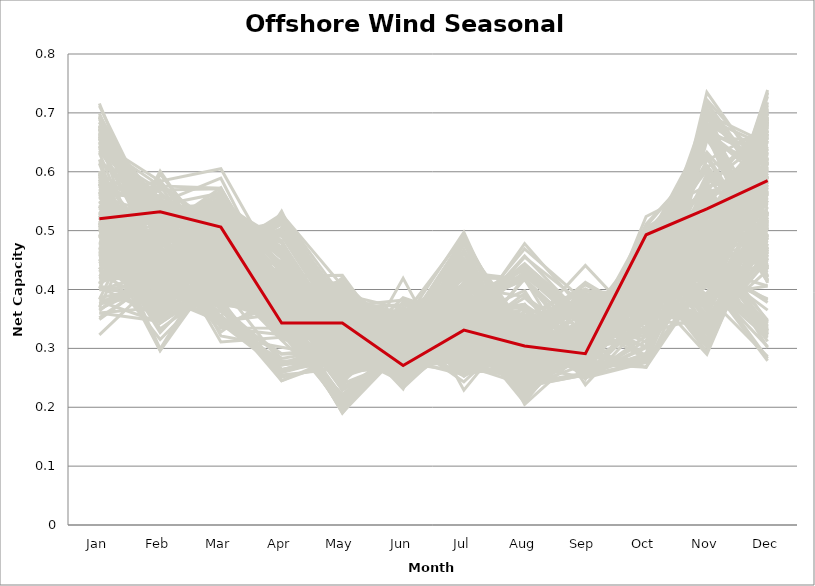
| Category | sample_001 | sample_002 | sample_003 | sample_004 | sample_005 | sample_006 | sample_007 | sample_008 | sample_009 | sample_010 | sample_011 | sample_012 | sample_013 | sample_014 | sample_015 | sample_016 | sample_017 | sample_018 | sample_019 | sample_020 | sample_021 | sample_022 | sample_023 | sample_024 | sample_025 | sample_026 | sample_027 | sample_028 | sample_029 | sample_030 | sample_031 | sample_032 | sample_033 | sample_034 | sample_035 | sample_036 | sample_037 | sample_038 | sample_039 | sample_040 | sample_041 | sample_042 | sample_043 | sample_044 | sample_045 | sample_046 | sample_047 | sample_048 | sample_049 | sample_050 | sample_051 | sample_052 | sample_053 | sample_054 | sample_055 | sample_056 | sample_057 | sample_058 | sample_059 | sample_060 | sample_061 | sample_062 | sample_063 | sample_064 | sample_065 | sample_066 | sample_067 | sample_068 | sample_069 | sample_070 | sample_071 | sample_072 | sample_073 | sample_074 | sample_075 | sample_076 | sample_077 | sample_078 | sample_079 | sample_080 | sample_081 | sample_082 | sample_083 | sample_084 | sample_085 | sample_086 | sample_087 | sample_088 | sample_089 | sample_090 | sample_091 | sample_092 | sample_093 | sample_094 | sample_095 | sample_096 | sample_097 | sample_098 | sample_099 | sample_100 | sample_101 | sample_102 | sample_103 | sample_104 | sample_105 | sample_106 | sample_107 | sample_108 | sample_109 | sample_110 | sample_111 | sample_112 | sample_113 | sample_114 | sample_115 | sample_116 | sample_117 | sample_118 | sample_119 | sample_120 | sample_121 | sample_122 | sample_123 | sample_124 | sample_125 | sample_126 | sample_127 | sample_128 | sample_129 | sample_130 | sample_131 | sample_132 | sample_133 | sample_134 | sample_135 | sample_136 | sample_137 | sample_138 | sample_139 | sample_140 | sample_141 | sample_142 | sample_143 | sample_144 | sample_145 | sample_146 | sample_147 | sample_148 | sample_149 | sample_150 | sample_151 | sample_152 | sample_153 | sample_154 | sample_155 | sample_156 | sample_157 | sample_158 | sample_159 | sample_160 | sample_161 | sample_162 | sample_163 | sample_164 | sample_165 | sample_166 | sample_167 | sample_168 | sample_169 | sample_170 | sample_171 | sample_172 | sample_173 | sample_174 | sample_175 | sample_176 | sample_177 | sample_178 | sample_179 | sample_180 | sample_181 | sample_182 | sample_183 | sample_184 | sample_185 | sample_186 | sample_188 | sample_189 | sample_190 | sample_191 | sample_192 | sample_193 | sample_194 | sample_195 | sample_196 | sample_197 | sample_198 | sample_199 | sample_200 | sample_201 | sample_202 | sample_203 | sample_204 | sample_205 | sample_206 | sample_207 | sample_208 | sample_209 | sample_210 | sample_211 | sample_212 | sample_213 | sample_214 | sample_215 | sample_216 | sample_217 | sample_218 | sample_219 | sample_220 | sample_221 | sample_222 | sample_223 | sample_224 | sample_225 | sample_226 | sample_227 | sample_228 | sample_229 | sample_230 | sample_231 | sample_232 | sample_233 | sample_234 | sample_235 | sample_236 | sample_237 | sample_238 | sample_239 | sample_240 | sample_241 | sample_242 | sample_243 | sample_244 | sample_245 | sample_246 | sample_247 | sample_248 | sample_249 | sample_250 | sample_187 |
|---|---|---|---|---|---|---|---|---|---|---|---|---|---|---|---|---|---|---|---|---|---|---|---|---|---|---|---|---|---|---|---|---|---|---|---|---|---|---|---|---|---|---|---|---|---|---|---|---|---|---|---|---|---|---|---|---|---|---|---|---|---|---|---|---|---|---|---|---|---|---|---|---|---|---|---|---|---|---|---|---|---|---|---|---|---|---|---|---|---|---|---|---|---|---|---|---|---|---|---|---|---|---|---|---|---|---|---|---|---|---|---|---|---|---|---|---|---|---|---|---|---|---|---|---|---|---|---|---|---|---|---|---|---|---|---|---|---|---|---|---|---|---|---|---|---|---|---|---|---|---|---|---|---|---|---|---|---|---|---|---|---|---|---|---|---|---|---|---|---|---|---|---|---|---|---|---|---|---|---|---|---|---|---|---|---|---|---|---|---|---|---|---|---|---|---|---|---|---|---|---|---|---|---|---|---|---|---|---|---|---|---|---|---|---|---|---|---|---|---|---|---|---|---|---|---|---|---|---|---|---|---|---|---|---|---|---|---|---|---|---|---|---|---|---|---|---|---|---|---|---|
| Jan | 0.597 | 0.549 | 0.648 | 0.349 | 0.482 | 0.409 | 0.692 | 0.477 | 0.529 | 0.541 | 0.643 | 0.671 | 0.406 | 0.635 | 0.467 | 0.656 | 0.36 | 0.323 | 0.508 | 0.66 | 0.533 | 0.689 | 0.679 | 0.549 | 0.521 | 0.587 | 0.442 | 0.529 | 0.651 | 0.644 | 0.496 | 0.565 | 0.454 | 0.509 | 0.565 | 0.669 | 0.674 | 0.642 | 0.579 | 0.37 | 0.465 | 0.53 | 0.376 | 0.586 | 0.654 | 0.673 | 0.47 | 0.448 | 0.512 | 0.542 | 0.684 | 0.677 | 0.462 | 0.483 | 0.575 | 0.383 | 0.43 | 0.634 | 0.496 | 0.588 | 0.53 | 0.614 | 0.658 | 0.646 | 0.411 | 0.526 | 0.562 | 0.595 | 0.599 | 0.49 | 0.472 | 0.399 | 0.449 | 0.504 | 0.529 | 0.639 | 0.514 | 0.53 | 0.529 | 0.517 | 0.47 | 0.549 | 0.364 | 0.458 | 0.486 | 0.508 | 0.517 | 0.352 | 0.46 | 0.557 | 0.508 | 0.671 | 0.636 | 0.662 | 0.507 | 0.65 | 0.491 | 0.464 | 0.491 | 0.583 | 0.566 | 0.48 | 0.656 | 0.584 | 0.452 | 0.465 | 0.716 | 0.571 | 0.481 | 0.41 | 0.451 | 0.499 | 0.459 | 0.455 | 0.366 | 0.516 | 0.597 | 0.505 | 0.527 | 0.494 | 0.667 | 0.595 | 0.601 | 0.544 | 0.617 | 0.666 | 0.55 | 0.569 | 0.448 | 0.426 | 0.474 | 0.522 | 0.504 | 0.505 | 0.443 | 0.538 | 0.696 | 0.559 | 0.525 | 0.452 | 0.588 | 0.595 | 0.443 | 0.434 | 0.4 | 0.434 | 0.419 | 0.467 | 0.65 | 0.693 | 0.673 | 0.712 | 0.672 | 0.58 | 0.468 | 0.479 | 0.456 | 0.558 | 0.423 | 0.422 | 0.621 | 0.402 | 0.383 | 0.541 | 0.489 | 0.693 | 0.508 | 0.678 | 0.663 | 0.458 | 0.509 | 0.583 | 0.523 | 0.502 | 0.512 | 0.471 | 0.423 | 0.643 | 0.531 | 0.556 | 0.645 | 0.486 | 0.566 | 0.512 | 0.497 | 0.521 | 0.375 | 0.433 | 0.507 | 0.38 | 0.36 | 0.664 | 0.597 | 0.564 | 0.656 | 0.578 | 0.676 | 0.684 | 0.477 | 0.488 | 0.526 | 0.5 | 0.418 | 0.632 | 0.58 | 0.451 | 0.418 | 0.492 | 0.528 | 0.386 | 0.578 | 0.367 | 0.53 | 0.428 | 0.592 | 0.563 | 0.494 | 0.665 | 0.402 | 0.616 | 0.515 | 0.66 | 0.438 | 0.542 | 0.533 | 0.492 | 0.411 | 0.49 | 0.376 | 0.47 | 0.517 | 0.523 | 0.674 | 0.514 | 0.404 | 0.455 | 0.471 | 0.511 | 0.506 | 0.461 | 0.501 | 0.591 | 0.573 | 0.453 | 0.699 | 0.515 | 0.443 | 0.54 | 0.639 | 0.52 |
| Feb | 0.465 | 0.471 | 0.522 | 0.425 | 0.424 | 0.52 | 0.477 | 0.549 | 0.521 | 0.426 | 0.538 | 0.526 | 0.381 | 0.556 | 0.551 | 0.485 | 0.346 | 0.421 | 0.526 | 0.501 | 0.473 | 0.514 | 0.435 | 0.473 | 0.442 | 0.399 | 0.435 | 0.487 | 0.44 | 0.531 | 0.523 | 0.584 | 0.495 | 0.333 | 0.445 | 0.52 | 0.514 | 0.447 | 0.399 | 0.585 | 0.423 | 0.447 | 0.428 | 0.411 | 0.55 | 0.501 | 0.551 | 0.533 | 0.359 | 0.468 | 0.528 | 0.519 | 0.534 | 0.438 | 0.437 | 0.596 | 0.561 | 0.569 | 0.494 | 0.542 | 0.388 | 0.347 | 0.514 | 0.576 | 0.454 | 0.299 | 0.407 | 0.39 | 0.346 | 0.413 | 0.352 | 0.432 | 0.42 | 0.362 | 0.492 | 0.54 | 0.363 | 0.436 | 0.522 | 0.503 | 0.507 | 0.509 | 0.444 | 0.548 | 0.519 | 0.516 | 0.405 | 0.422 | 0.344 | 0.527 | 0.374 | 0.536 | 0.494 | 0.499 | 0.423 | 0.584 | 0.5 | 0.374 | 0.424 | 0.449 | 0.405 | 0.409 | 0.51 | 0.541 | 0.425 | 0.415 | 0.464 | 0.431 | 0.482 | 0.579 | 0.398 | 0.527 | 0.535 | 0.542 | 0.426 | 0.528 | 0.538 | 0.393 | 0.549 | 0.327 | 0.522 | 0.41 | 0.409 | 0.455 | 0.533 | 0.489 | 0.415 | 0.463 | 0.315 | 0.374 | 0.548 | 0.398 | 0.453 | 0.476 | 0.419 | 0.447 | 0.515 | 0.458 | 0.522 | 0.357 | 0.436 | 0.407 | 0.416 | 0.575 | 0.393 | 0.553 | 0.433 | 0.354 | 0.523 | 0.507 | 0.452 | 0.501 | 0.52 | 0.371 | 0.503 | 0.425 | 0.409 | 0.472 | 0.428 | 0.515 | 0.348 | 0.601 | 0.379 | 0.414 | 0.526 | 0.445 | 0.541 | 0.428 | 0.486 | 0.527 | 0.352 | 0.452 | 0.509 | 0.56 | 0.543 | 0.356 | 0.457 | 0.518 | 0.481 | 0.454 | 0.51 | 0.531 | 0.447 | 0.297 | 0.576 | 0.371 | 0.407 | 0.411 | 0.534 | 0.344 | 0.37 | 0.543 | 0.457 | 0.42 | 0.496 | 0.416 | 0.479 | 0.505 | 0.535 | 0.519 | 0.381 | 0.527 | 0.509 | 0.382 | 0.414 | 0.354 | 0.42 | 0.486 | 0.489 | 0.407 | 0.421 | 0.414 | 0.481 | 0.448 | 0.389 | 0.554 | 0.402 | 0.497 | 0.406 | 0.565 | 0.391 | 0.343 | 0.407 | 0.388 | 0.412 | 0.296 | 0.474 | 0.428 | 0.416 | 0.401 | 0.414 | 0.394 | 0.547 | 0.388 | 0.353 | 0.435 | 0.421 | 0.535 | 0.549 | 0.549 | 0.343 | 0.403 | 0.548 | 0.399 | 0.476 | 0.494 | 0.453 | 0.466 | 0.539 | 0.532 |
| Mar | 0.419 | 0.419 | 0.504 | 0.451 | 0.345 | 0.499 | 0.466 | 0.503 | 0.335 | 0.499 | 0.545 | 0.478 | 0.427 | 0.449 | 0.516 | 0.518 | 0.5 | 0.424 | 0.487 | 0.573 | 0.389 | 0.454 | 0.547 | 0.559 | 0.549 | 0.381 | 0.515 | 0.407 | 0.533 | 0.536 | 0.404 | 0.46 | 0.346 | 0.408 | 0.406 | 0.483 | 0.494 | 0.554 | 0.353 | 0.438 | 0.539 | 0.373 | 0.452 | 0.485 | 0.523 | 0.458 | 0.507 | 0.484 | 0.523 | 0.399 | 0.464 | 0.444 | 0.499 | 0.342 | 0.42 | 0.468 | 0.488 | 0.571 | 0.352 | 0.482 | 0.394 | 0.406 | 0.465 | 0.572 | 0.328 | 0.466 | 0.524 | 0.451 | 0.404 | 0.354 | 0.419 | 0.339 | 0.534 | 0.555 | 0.435 | 0.53 | 0.526 | 0.374 | 0.335 | 0.407 | 0.556 | 0.321 | 0.429 | 0.474 | 0.51 | 0.372 | 0.509 | 0.437 | 0.411 | 0.474 | 0.544 | 0.456 | 0.478 | 0.466 | 0.384 | 0.605 | 0.519 | 0.551 | 0.348 | 0.391 | 0.514 | 0.4 | 0.564 | 0.486 | 0.517 | 0.523 | 0.449 | 0.416 | 0.383 | 0.502 | 0.39 | 0.504 | 0.471 | 0.489 | 0.415 | 0.373 | 0.483 | 0.546 | 0.5 | 0.435 | 0.535 | 0.423 | 0.47 | 0.424 | 0.472 | 0.513 | 0.375 | 0.402 | 0.42 | 0.432 | 0.498 | 0.505 | 0.408 | 0.544 | 0.526 | 0.438 | 0.469 | 0.441 | 0.379 | 0.443 | 0.416 | 0.374 | 0.538 | 0.504 | 0.403 | 0.417 | 0.543 | 0.42 | 0.496 | 0.462 | 0.545 | 0.459 | 0.516 | 0.363 | 0.562 | 0.408 | 0.338 | 0.366 | 0.535 | 0.548 | 0.411 | 0.453 | 0.419 | 0.351 | 0.504 | 0.545 | 0.497 | 0.55 | 0.553 | 0.532 | 0.531 | 0.401 | 0.406 | 0.501 | 0.377 | 0.52 | 0.532 | 0.494 | 0.408 | 0.407 | 0.464 | 0.387 | 0.414 | 0.455 | 0.434 | 0.544 | 0.421 | 0.532 | 0.488 | 0.513 | 0.464 | 0.564 | 0.414 | 0.423 | 0.471 | 0.446 | 0.51 | 0.443 | 0.425 | 0.378 | 0.405 | 0.519 | 0.515 | 0.462 | 0.379 | 0.435 | 0.428 | 0.568 | 0.311 | 0.419 | 0.417 | 0.396 | 0.386 | 0.537 | 0.381 | 0.466 | 0.395 | 0.444 | 0.377 | 0.473 | 0.349 | 0.411 | 0.545 | 0.345 | 0.369 | 0.44 | 0.528 | 0.355 | 0.382 | 0.464 | 0.494 | 0.515 | 0.589 | 0.523 | 0.5 | 0.54 | 0.362 | 0.386 | 0.481 | 0.481 | 0.413 | 0.472 | 0.492 | 0.507 | 0.436 | 0.513 | 0.552 | 0.442 | 0.54 | 0.506 |
| Apr | 0.316 | 0.314 | 0.401 | 0.339 | 0.272 | 0.403 | 0.499 | 0.345 | 0.334 | 0.375 | 0.397 | 0.516 | 0.325 | 0.404 | 0.361 | 0.481 | 0.335 | 0.352 | 0.352 | 0.378 | 0.349 | 0.516 | 0.453 | 0.32 | 0.324 | 0.502 | 0.458 | 0.274 | 0.454 | 0.409 | 0.369 | 0.39 | 0.359 | 0.366 | 0.33 | 0.512 | 0.515 | 0.455 | 0.525 | 0.365 | 0.471 | 0.255 | 0.324 | 0.36 | 0.4 | 0.503 | 0.346 | 0.397 | 0.38 | 0.352 | 0.52 | 0.501 | 0.338 | 0.263 | 0.381 | 0.376 | 0.383 | 0.401 | 0.277 | 0.408 | 0.366 | 0.424 | 0.511 | 0.397 | 0.401 | 0.364 | 0.408 | 0.327 | 0.418 | 0.29 | 0.342 | 0.376 | 0.457 | 0.395 | 0.365 | 0.395 | 0.393 | 0.264 | 0.323 | 0.373 | 0.327 | 0.302 | 0.371 | 0.35 | 0.346 | 0.283 | 0.411 | 0.342 | 0.366 | 0.385 | 0.454 | 0.498 | 0.491 | 0.503 | 0.245 | 0.422 | 0.354 | 0.377 | 0.272 | 0.368 | 0.388 | 0.416 | 0.382 | 0.371 | 0.47 | 0.48 | 0.511 | 0.325 | 0.347 | 0.412 | 0.398 | 0.366 | 0.387 | 0.378 | 0.344 | 0.365 | 0.396 | 0.483 | 0.361 | 0.356 | 0.413 | 0.339 | 0.349 | 0.326 | 0.514 | 0.48 | 0.251 | 0.358 | 0.342 | 0.345 | 0.351 | 0.392 | 0.413 | 0.319 | 0.461 | 0.431 | 0.499 | 0.401 | 0.401 | 0.363 | 0.326 | 0.533 | 0.462 | 0.359 | 0.332 | 0.449 | 0.439 | 0.387 | 0.414 | 0.528 | 0.464 | 0.495 | 0.387 | 0.505 | 0.342 | 0.403 | 0.383 | 0.245 | 0.436 | 0.369 | 0.403 | 0.384 | 0.325 | 0.26 | 0.338 | 0.443 | 0.336 | 0.467 | 0.47 | 0.364 | 0.37 | 0.352 | 0.347 | 0.319 | 0.433 | 0.366 | 0.42 | 0.387 | 0.342 | 0.348 | 0.516 | 0.356 | 0.336 | 0.362 | 0.399 | 0.479 | 0.356 | 0.46 | 0.341 | 0.337 | 0.34 | 0.393 | 0.437 | 0.381 | 0.5 | 0.371 | 0.48 | 0.528 | 0.406 | 0.347 | 0.371 | 0.342 | 0.393 | 0.317 | 0.264 | 0.382 | 0.353 | 0.34 | 0.319 | 0.328 | 0.337 | 0.365 | 0.352 | 0.445 | 0.526 | 0.399 | 0.359 | 0.517 | 0.382 | 0.421 | 0.277 | 0.423 | 0.463 | 0.279 | 0.259 | 0.359 | 0.43 | 0.272 | 0.365 | 0.442 | 0.402 | 0.405 | 0.387 | 0.481 | 0.338 | 0.472 | 0.291 | 0.352 | 0.348 | 0.373 | 0.376 | 0.339 | 0.369 | 0.364 | 0.525 | 0.345 | 0.465 | 0.338 | 0.418 | 0.343 |
| May | 0.287 | 0.217 | 0.356 | 0.342 | 0.286 | 0.275 | 0.357 | 0.406 | 0.297 | 0.257 | 0.387 | 0.381 | 0.361 | 0.353 | 0.4 | 0.325 | 0.258 | 0.313 | 0.378 | 0.382 | 0.198 | 0.363 | 0.31 | 0.396 | 0.404 | 0.326 | 0.296 | 0.31 | 0.32 | 0.369 | 0.23 | 0.374 | 0.359 | 0.355 | 0.206 | 0.38 | 0.332 | 0.321 | 0.311 | 0.392 | 0.279 | 0.266 | 0.369 | 0.347 | 0.373 | 0.36 | 0.387 | 0.376 | 0.257 | 0.193 | 0.373 | 0.355 | 0.328 | 0.297 | 0.34 | 0.39 | 0.397 | 0.413 | 0.287 | 0.409 | 0.306 | 0.323 | 0.369 | 0.403 | 0.256 | 0.364 | 0.252 | 0.325 | 0.335 | 0.295 | 0.393 | 0.28 | 0.287 | 0.255 | 0.217 | 0.376 | 0.251 | 0.286 | 0.309 | 0.229 | 0.412 | 0.284 | 0.326 | 0.406 | 0.319 | 0.3 | 0.265 | 0.328 | 0.368 | 0.332 | 0.293 | 0.365 | 0.332 | 0.356 | 0.289 | 0.424 | 0.39 | 0.268 | 0.3 | 0.19 | 0.243 | 0.284 | 0.392 | 0.347 | 0.296 | 0.297 | 0.376 | 0.21 | 0.356 | 0.398 | 0.286 | 0.397 | 0.373 | 0.399 | 0.302 | 0.191 | 0.406 | 0.29 | 0.361 | 0.35 | 0.371 | 0.205 | 0.344 | 0.222 | 0.365 | 0.318 | 0.272 | 0.199 | 0.397 | 0.381 | 0.385 | 0.259 | 0.292 | 0.413 | 0.298 | 0.288 | 0.364 | 0.262 | 0.229 | 0.405 | 0.204 | 0.321 | 0.29 | 0.417 | 0.375 | 0.282 | 0.283 | 0.363 | 0.362 | 0.406 | 0.319 | 0.36 | 0.345 | 0.324 | 0.42 | 0.294 | 0.236 | 0.283 | 0.275 | 0.284 | 0.326 | 0.399 | 0.375 | 0.286 | 0.325 | 0.329 | 0.333 | 0.323 | 0.315 | 0.417 | 0.282 | 0.196 | 0.2 | 0.325 | 0.24 | 0.26 | 0.267 | 0.341 | 0.213 | 0.195 | 0.356 | 0.235 | 0.207 | 0.378 | 0.282 | 0.297 | 0.319 | 0.278 | 0.332 | 0.272 | 0.243 | 0.396 | 0.25 | 0.335 | 0.346 | 0.333 | 0.32 | 0.387 | 0.259 | 0.216 | 0.312 | 0.326 | 0.268 | 0.323 | 0.277 | 0.361 | 0.329 | 0.413 | 0.292 | 0.315 | 0.198 | 0.299 | 0.198 | 0.266 | 0.326 | 0.367 | 0.295 | 0.38 | 0.276 | 0.313 | 0.282 | 0.331 | 0.28 | 0.278 | 0.286 | 0.369 | 0.259 | 0.284 | 0.289 | 0.284 | 0.259 | 0.247 | 0.405 | 0.292 | 0.262 | 0.291 | 0.301 | 0.219 | 0.403 | 0.385 | 0.351 | 0.34 | 0.339 | 0.263 | 0.374 | 0.398 | 0.294 | 0.221 | 0.375 | 0.343 |
| Jun | 0.386 | 0.315 | 0.349 | 0.352 | 0.323 | 0.254 | 0.301 | 0.244 | 0.305 | 0.331 | 0.359 | 0.289 | 0.363 | 0.351 | 0.286 | 0.28 | 0.33 | 0.354 | 0.284 | 0.338 | 0.3 | 0.312 | 0.288 | 0.295 | 0.316 | 0.256 | 0.281 | 0.334 | 0.303 | 0.374 | 0.293 | 0.263 | 0.331 | 0.307 | 0.316 | 0.277 | 0.271 | 0.302 | 0.258 | 0.302 | 0.269 | 0.355 | 0.347 | 0.24 | 0.354 | 0.307 | 0.288 | 0.253 | 0.357 | 0.334 | 0.314 | 0.31 | 0.261 | 0.314 | 0.231 | 0.273 | 0.244 | 0.293 | 0.325 | 0.257 | 0.324 | 0.27 | 0.292 | 0.305 | 0.342 | 0.26 | 0.285 | 0.251 | 0.25 | 0.306 | 0.313 | 0.362 | 0.264 | 0.345 | 0.316 | 0.361 | 0.333 | 0.355 | 0.32 | 0.293 | 0.3 | 0.33 | 0.337 | 0.259 | 0.264 | 0.324 | 0.347 | 0.342 | 0.307 | 0.278 | 0.275 | 0.302 | 0.271 | 0.271 | 0.334 | 0.284 | 0.289 | 0.353 | 0.325 | 0.315 | 0.333 | 0.292 | 0.367 | 0.27 | 0.267 | 0.278 | 0.323 | 0.321 | 0.301 | 0.233 | 0.305 | 0.292 | 0.251 | 0.252 | 0.358 | 0.298 | 0.277 | 0.265 | 0.279 | 0.291 | 0.382 | 0.301 | 0.238 | 0.306 | 0.273 | 0.269 | 0.338 | 0.33 | 0.306 | 0.299 | 0.283 | 0.363 | 0.285 | 0.319 | 0.264 | 0.293 | 0.314 | 0.314 | 0.3 | 0.289 | 0.324 | 0.243 | 0.269 | 0.239 | 0.34 | 0.356 | 0.266 | 0.303 | 0.335 | 0.329 | 0.289 | 0.285 | 0.358 | 0.259 | 0.29 | 0.285 | 0.419 | 0.357 | 0.268 | 0.276 | 0.255 | 0.301 | 0.353 | 0.309 | 0.274 | 0.288 | 0.264 | 0.282 | 0.297 | 0.284 | 0.359 | 0.33 | 0.297 | 0.277 | 0.281 | 0.369 | 0.27 | 0.363 | 0.314 | 0.31 | 0.275 | 0.282 | 0.314 | 0.278 | 0.32 | 0.294 | 0.357 | 0.267 | 0.257 | 0.323 | 0.355 | 0.32 | 0.321 | 0.241 | 0.263 | 0.253 | 0.269 | 0.329 | 0.378 | 0.289 | 0.31 | 0.264 | 0.265 | 0.257 | 0.353 | 0.294 | 0.349 | 0.306 | 0.331 | 0.37 | 0.317 | 0.342 | 0.309 | 0.265 | 0.251 | 0.263 | 0.305 | 0.34 | 0.328 | 0.333 | 0.321 | 0.25 | 0.258 | 0.308 | 0.347 | 0.28 | 0.269 | 0.313 | 0.33 | 0.263 | 0.362 | 0.337 | 0.283 | 0.278 | 0.33 | 0.262 | 0.311 | 0.293 | 0.26 | 0.25 | 0.301 | 0.238 | 0.267 | 0.379 | 0.338 | 0.296 | 0.243 | 0.304 | 0.361 | 0.271 |
| Jul | 0.351 | 0.243 | 0.375 | 0.265 | 0.445 | 0.334 | 0.377 | 0.311 | 0.432 | 0.369 | 0.352 | 0.397 | 0.291 | 0.429 | 0.287 | 0.396 | 0.487 | 0.253 | 0.287 | 0.365 | 0.303 | 0.404 | 0.339 | 0.291 | 0.292 | 0.382 | 0.293 | 0.433 | 0.363 | 0.343 | 0.274 | 0.312 | 0.356 | 0.326 | 0.274 | 0.374 | 0.382 | 0.354 | 0.352 | 0.301 | 0.299 | 0.425 | 0.272 | 0.462 | 0.356 | 0.388 | 0.292 | 0.319 | 0.373 | 0.277 | 0.403 | 0.397 | 0.333 | 0.451 | 0.449 | 0.315 | 0.332 | 0.36 | 0.422 | 0.316 | 0.401 | 0.413 | 0.382 | 0.342 | 0.434 | 0.374 | 0.382 | 0.488 | 0.427 | 0.452 | 0.307 | 0.429 | 0.3 | 0.363 | 0.274 | 0.352 | 0.382 | 0.437 | 0.442 | 0.273 | 0.291 | 0.44 | 0.27 | 0.318 | 0.318 | 0.424 | 0.359 | 0.267 | 0.347 | 0.323 | 0.261 | 0.409 | 0.402 | 0.384 | 0.439 | 0.345 | 0.289 | 0.34 | 0.449 | 0.276 | 0.373 | 0.363 | 0.36 | 0.3 | 0.293 | 0.289 | 0.379 | 0.26 | 0.388 | 0.329 | 0.48 | 0.288 | 0.328 | 0.314 | 0.257 | 0.303 | 0.3 | 0.281 | 0.31 | 0.366 | 0.347 | 0.281 | 0.489 | 0.255 | 0.386 | 0.361 | 0.418 | 0.273 | 0.31 | 0.329 | 0.292 | 0.356 | 0.346 | 0.296 | 0.287 | 0.317 | 0.39 | 0.323 | 0.267 | 0.334 | 0.263 | 0.36 | 0.339 | 0.316 | 0.279 | 0.299 | 0.328 | 0.36 | 0.404 | 0.397 | 0.347 | 0.402 | 0.388 | 0.384 | 0.281 | 0.349 | 0.229 | 0.419 | 0.324 | 0.31 | 0.432 | 0.3 | 0.285 | 0.442 | 0.312 | 0.352 | 0.325 | 0.367 | 0.344 | 0.284 | 0.372 | 0.273 | 0.299 | 0.33 | 0.255 | 0.335 | 0.338 | 0.368 | 0.296 | 0.277 | 0.36 | 0.303 | 0.253 | 0.384 | 0.398 | 0.279 | 0.256 | 0.317 | 0.321 | 0.478 | 0.491 | 0.361 | 0.296 | 0.439 | 0.397 | 0.468 | 0.378 | 0.401 | 0.353 | 0.291 | 0.411 | 0.32 | 0.335 | 0.493 | 0.424 | 0.341 | 0.259 | 0.286 | 0.449 | 0.268 | 0.264 | 0.497 | 0.302 | 0.324 | 0.362 | 0.312 | 0.39 | 0.41 | 0.483 | 0.421 | 0.446 | 0.409 | 0.325 | 0.422 | 0.42 | 0.376 | 0.345 | 0.438 | 0.487 | 0.356 | 0.352 | 0.366 | 0.331 | 0.298 | 0.478 | 0.317 | 0.451 | 0.301 | 0.317 | 0.328 | 0.342 | 0.479 | 0.306 | 0.33 | 0.4 | 0.29 | 0.323 | 0.254 | 0.357 | 0.331 |
| Aug | 0.341 | 0.339 | 0.416 | 0.252 | 0.295 | 0.325 | 0.249 | 0.253 | 0.249 | 0.281 | 0.438 | 0.244 | 0.253 | 0.417 | 0.281 | 0.293 | 0.31 | 0.308 | 0.267 | 0.423 | 0.31 | 0.243 | 0.303 | 0.271 | 0.273 | 0.357 | 0.332 | 0.264 | 0.304 | 0.457 | 0.356 | 0.356 | 0.357 | 0.228 | 0.323 | 0.246 | 0.286 | 0.306 | 0.398 | 0.255 | 0.344 | 0.276 | 0.238 | 0.267 | 0.43 | 0.248 | 0.266 | 0.235 | 0.287 | 0.301 | 0.245 | 0.255 | 0.315 | 0.28 | 0.292 | 0.244 | 0.225 | 0.442 | 0.257 | 0.324 | 0.315 | 0.346 | 0.266 | 0.455 | 0.318 | 0.235 | 0.293 | 0.286 | 0.338 | 0.286 | 0.249 | 0.278 | 0.328 | 0.307 | 0.291 | 0.443 | 0.29 | 0.289 | 0.259 | 0.353 | 0.28 | 0.258 | 0.275 | 0.25 | 0.322 | 0.258 | 0.294 | 0.256 | 0.215 | 0.322 | 0.364 | 0.245 | 0.276 | 0.26 | 0.293 | 0.469 | 0.274 | 0.293 | 0.309 | 0.302 | 0.308 | 0.369 | 0.425 | 0.344 | 0.335 | 0.343 | 0.224 | 0.324 | 0.343 | 0.213 | 0.318 | 0.28 | 0.223 | 0.237 | 0.273 | 0.346 | 0.339 | 0.334 | 0.326 | 0.235 | 0.427 | 0.322 | 0.269 | 0.353 | 0.259 | 0.293 | 0.294 | 0.319 | 0.245 | 0.229 | 0.258 | 0.289 | 0.366 | 0.267 | 0.334 | 0.393 | 0.247 | 0.386 | 0.374 | 0.208 | 0.338 | 0.374 | 0.308 | 0.247 | 0.243 | 0.418 | 0.316 | 0.238 | 0.388 | 0.216 | 0.327 | 0.242 | 0.433 | 0.356 | 0.276 | 0.375 | 0.356 | 0.277 | 0.323 | 0.329 | 0.336 | 0.26 | 0.25 | 0.291 | 0.316 | 0.312 | 0.327 | 0.312 | 0.304 | 0.272 | 0.304 | 0.309 | 0.322 | 0.303 | 0.354 | 0.3 | 0.314 | 0.418 | 0.296 | 0.303 | 0.259 | 0.322 | 0.349 | 0.236 | 0.29 | 0.354 | 0.274 | 0.315 | 0.325 | 0.334 | 0.302 | 0.444 | 0.42 | 0.313 | 0.259 | 0.268 | 0.304 | 0.205 | 0.348 | 0.333 | 0.298 | 0.308 | 0.336 | 0.272 | 0.288 | 0.233 | 0.285 | 0.257 | 0.25 | 0.254 | 0.338 | 0.271 | 0.312 | 0.332 | 0.375 | 0.326 | 0.318 | 0.22 | 0.32 | 0.417 | 0.315 | 0.348 | 0.3 | 0.298 | 0.294 | 0.24 | 0.323 | 0.298 | 0.295 | 0.355 | 0.288 | 0.291 | 0.478 | 0.333 | 0.323 | 0.341 | 0.283 | 0.354 | 0.265 | 0.232 | 0.24 | 0.259 | 0.326 | 0.309 | 0.225 | 0.29 | 0.322 | 0.329 | 0.442 | 0.304 |
| Sep | 0.297 | 0.294 | 0.324 | 0.323 | 0.332 | 0.412 | 0.351 | 0.317 | 0.293 | 0.374 | 0.338 | 0.36 | 0.302 | 0.304 | 0.295 | 0.312 | 0.254 | 0.283 | 0.295 | 0.342 | 0.303 | 0.339 | 0.319 | 0.279 | 0.277 | 0.256 | 0.369 | 0.315 | 0.308 | 0.349 | 0.283 | 0.255 | 0.297 | 0.301 | 0.278 | 0.356 | 0.347 | 0.308 | 0.238 | 0.298 | 0.398 | 0.301 | 0.33 | 0.307 | 0.332 | 0.338 | 0.293 | 0.334 | 0.302 | 0.295 | 0.346 | 0.351 | 0.275 | 0.314 | 0.28 | 0.297 | 0.332 | 0.356 | 0.297 | 0.258 | 0.304 | 0.269 | 0.327 | 0.373 | 0.29 | 0.255 | 0.383 | 0.3 | 0.267 | 0.324 | 0.298 | 0.297 | 0.383 | 0.307 | 0.312 | 0.34 | 0.311 | 0.285 | 0.305 | 0.287 | 0.288 | 0.31 | 0.305 | 0.318 | 0.283 | 0.303 | 0.351 | 0.319 | 0.311 | 0.279 | 0.318 | 0.351 | 0.339 | 0.343 | 0.3 | 0.379 | 0.28 | 0.308 | 0.316 | 0.3 | 0.372 | 0.25 | 0.333 | 0.279 | 0.369 | 0.38 | 0.297 | 0.285 | 0.276 | 0.33 | 0.274 | 0.276 | 0.313 | 0.329 | 0.297 | 0.295 | 0.263 | 0.391 | 0.259 | 0.273 | 0.345 | 0.308 | 0.297 | 0.3 | 0.345 | 0.319 | 0.285 | 0.303 | 0.288 | 0.322 | 0.283 | 0.344 | 0.253 | 0.29 | 0.385 | 0.275 | 0.346 | 0.293 | 0.303 | 0.337 | 0.282 | 0.252 | 0.4 | 0.34 | 0.293 | 0.248 | 0.378 | 0.282 | 0.317 | 0.309 | 0.318 | 0.336 | 0.331 | 0.253 | 0.297 | 0.253 | 0.401 | 0.304 | 0.392 | 0.441 | 0.261 | 0.305 | 0.299 | 0.311 | 0.271 | 0.306 | 0.271 | 0.316 | 0.318 | 0.298 | 0.29 | 0.305 | 0.302 | 0.291 | 0.322 | 0.312 | 0.369 | 0.321 | 0.296 | 0.302 | 0.344 | 0.279 | 0.286 | 0.255 | 0.271 | 0.359 | 0.294 | 0.383 | 0.288 | 0.252 | 0.263 | 0.352 | 0.289 | 0.283 | 0.352 | 0.303 | 0.31 | 0.298 | 0.289 | 0.278 | 0.302 | 0.282 | 0.408 | 0.287 | 0.299 | 0.287 | 0.286 | 0.286 | 0.292 | 0.308 | 0.283 | 0.25 | 0.307 | 0.383 | 0.249 | 0.259 | 0.303 | 0.325 | 0.274 | 0.293 | 0.324 | 0.26 | 0.391 | 0.331 | 0.268 | 0.258 | 0.378 | 0.313 | 0.264 | 0.277 | 0.364 | 0.327 | 0.36 | 0.359 | 0.253 | 0.39 | 0.335 | 0.277 | 0.323 | 0.34 | 0.292 | 0.305 | 0.282 | 0.289 | 0.313 | 0.279 | 0.394 | 0.286 | 0.345 | 0.291 |
| Oct | 0.38 | 0.414 | 0.37 | 0.479 | 0.414 | 0.35 | 0.415 | 0.429 | 0.355 | 0.404 | 0.303 | 0.437 | 0.456 | 0.43 | 0.456 | 0.488 | 0.301 | 0.511 | 0.459 | 0.282 | 0.359 | 0.422 | 0.485 | 0.467 | 0.477 | 0.359 | 0.375 | 0.381 | 0.48 | 0.302 | 0.36 | 0.415 | 0.403 | 0.427 | 0.425 | 0.439 | 0.48 | 0.48 | 0.348 | 0.407 | 0.39 | 0.368 | 0.469 | 0.457 | 0.344 | 0.43 | 0.464 | 0.427 | 0.471 | 0.432 | 0.41 | 0.421 | 0.491 | 0.414 | 0.431 | 0.417 | 0.421 | 0.286 | 0.349 | 0.4 | 0.428 | 0.398 | 0.442 | 0.286 | 0.276 | 0.409 | 0.419 | 0.429 | 0.413 | 0.429 | 0.447 | 0.323 | 0.388 | 0.482 | 0.4 | 0.32 | 0.468 | 0.389 | 0.346 | 0.371 | 0.483 | 0.332 | 0.498 | 0.41 | 0.495 | 0.389 | 0.458 | 0.507 | 0.416 | 0.467 | 0.437 | 0.443 | 0.471 | 0.463 | 0.427 | 0.282 | 0.461 | 0.476 | 0.435 | 0.403 | 0.406 | 0.276 | 0.332 | 0.438 | 0.393 | 0.376 | 0.433 | 0.424 | 0.426 | 0.442 | 0.268 | 0.452 | 0.4 | 0.428 | 0.493 | 0.366 | 0.394 | 0.399 | 0.428 | 0.399 | 0.33 | 0.421 | 0.459 | 0.406 | 0.448 | 0.478 | 0.414 | 0.392 | 0.438 | 0.424 | 0.462 | 0.454 | 0.304 | 0.49 | 0.381 | 0.283 | 0.421 | 0.276 | 0.347 | 0.45 | 0.423 | 0.358 | 0.36 | 0.441 | 0.451 | 0.47 | 0.391 | 0.405 | 0.434 | 0.431 | 0.46 | 0.427 | 0.369 | 0.351 | 0.492 | 0.292 | 0.34 | 0.38 | 0.381 | 0.331 | 0.402 | 0.4 | 0.438 | 0.421 | 0.498 | 0.484 | 0.491 | 0.47 | 0.474 | 0.494 | 0.462 | 0.416 | 0.358 | 0.481 | 0.326 | 0.49 | 0.369 | 0.357 | 0.384 | 0.407 | 0.464 | 0.395 | 0.412 | 0.419 | 0.524 | 0.406 | 0.471 | 0.377 | 0.505 | 0.313 | 0.289 | 0.311 | 0.268 | 0.405 | 0.458 | 0.464 | 0.467 | 0.438 | 0.505 | 0.375 | 0.431 | 0.481 | 0.356 | 0.438 | 0.379 | 0.399 | 0.484 | 0.485 | 0.336 | 0.474 | 0.427 | 0.321 | 0.354 | 0.373 | 0.374 | 0.409 | 0.442 | 0.447 | 0.279 | 0.454 | 0.419 | 0.393 | 0.378 | 0.401 | 0.45 | 0.41 | 0.377 | 0.413 | 0.279 | 0.333 | 0.436 | 0.461 | 0.282 | 0.406 | 0.278 | 0.374 | 0.421 | 0.368 | 0.433 | 0.423 | 0.415 | 0.451 | 0.474 | 0.487 | 0.426 | 0.458 | 0.369 | 0.431 | 0.302 | 0.493 |
| Nov | 0.39 | 0.343 | 0.671 | 0.672 | 0.484 | 0.428 | 0.384 | 0.375 | 0.562 | 0.471 | 0.717 | 0.426 | 0.67 | 0.619 | 0.378 | 0.41 | 0.428 | 0.623 | 0.354 | 0.699 | 0.347 | 0.42 | 0.44 | 0.316 | 0.347 | 0.451 | 0.477 | 0.574 | 0.453 | 0.735 | 0.35 | 0.52 | 0.523 | 0.684 | 0.329 | 0.425 | 0.413 | 0.462 | 0.471 | 0.468 | 0.469 | 0.564 | 0.662 | 0.384 | 0.693 | 0.414 | 0.372 | 0.419 | 0.513 | 0.308 | 0.446 | 0.451 | 0.544 | 0.492 | 0.381 | 0.447 | 0.433 | 0.666 | 0.568 | 0.505 | 0.566 | 0.44 | 0.453 | 0.653 | 0.416 | 0.669 | 0.466 | 0.392 | 0.427 | 0.504 | 0.671 | 0.406 | 0.486 | 0.526 | 0.327 | 0.707 | 0.502 | 0.554 | 0.579 | 0.34 | 0.364 | 0.592 | 0.609 | 0.388 | 0.51 | 0.553 | 0.47 | 0.629 | 0.669 | 0.499 | 0.39 | 0.445 | 0.424 | 0.425 | 0.508 | 0.668 | 0.381 | 0.525 | 0.474 | 0.29 | 0.472 | 0.542 | 0.697 | 0.501 | 0.424 | 0.455 | 0.45 | 0.317 | 0.525 | 0.443 | 0.421 | 0.38 | 0.445 | 0.404 | 0.61 | 0.374 | 0.53 | 0.441 | 0.534 | 0.683 | 0.722 | 0.302 | 0.373 | 0.347 | 0.423 | 0.411 | 0.559 | 0.347 | 0.669 | 0.673 | 0.358 | 0.487 | 0.503 | 0.334 | 0.453 | 0.52 | 0.433 | 0.514 | 0.34 | 0.676 | 0.307 | 0.44 | 0.496 | 0.368 | 0.665 | 0.551 | 0.455 | 0.697 | 0.609 | 0.487 | 0.448 | 0.412 | 0.658 | 0.476 | 0.372 | 0.527 | 0.414 | 0.596 | 0.469 | 0.45 | 0.448 | 0.45 | 0.669 | 0.494 | 0.529 | 0.475 | 0.537 | 0.446 | 0.411 | 0.379 | 0.525 | 0.305 | 0.344 | 0.527 | 0.355 | 0.566 | 0.446 | 0.682 | 0.328 | 0.315 | 0.413 | 0.353 | 0.324 | 0.668 | 0.576 | 0.424 | 0.602 | 0.458 | 0.542 | 0.444 | 0.466 | 0.69 | 0.484 | 0.445 | 0.412 | 0.38 | 0.424 | 0.47 | 0.565 | 0.351 | 0.584 | 0.509 | 0.437 | 0.372 | 0.554 | 0.68 | 0.633 | 0.331 | 0.573 | 0.655 | 0.294 | 0.419 | 0.352 | 0.462 | 0.481 | 0.488 | 0.548 | 0.423 | 0.427 | 0.579 | 0.471 | 0.434 | 0.441 | 0.507 | 0.533 | 0.68 | 0.442 | 0.509 | 0.414 | 0.511 | 0.496 | 0.462 | 0.669 | 0.409 | 0.417 | 0.471 | 0.486 | 0.349 | 0.388 | 0.387 | 0.707 | 0.392 | 0.521 | 0.563 | 0.452 | 0.377 | 0.412 | 0.311 | 0.715 | 0.537 |
| Dec | 0.406 | 0.478 | 0.616 | 0.456 | 0.512 | 0.384 | 0.718 | 0.616 | 0.416 | 0.606 | 0.578 | 0.693 | 0.468 | 0.676 | 0.531 | 0.684 | 0.335 | 0.46 | 0.578 | 0.588 | 0.495 | 0.699 | 0.675 | 0.567 | 0.533 | 0.467 | 0.324 | 0.436 | 0.669 | 0.588 | 0.446 | 0.684 | 0.629 | 0.506 | 0.494 | 0.685 | 0.713 | 0.663 | 0.447 | 0.591 | 0.338 | 0.438 | 0.434 | 0.632 | 0.588 | 0.698 | 0.532 | 0.592 | 0.6 | 0.505 | 0.679 | 0.705 | 0.499 | 0.481 | 0.528 | 0.591 | 0.547 | 0.579 | 0.414 | 0.64 | 0.694 | 0.573 | 0.703 | 0.611 | 0.279 | 0.46 | 0.634 | 0.62 | 0.569 | 0.491 | 0.486 | 0.33 | 0.346 | 0.542 | 0.45 | 0.569 | 0.559 | 0.434 | 0.415 | 0.433 | 0.515 | 0.465 | 0.455 | 0.584 | 0.529 | 0.421 | 0.604 | 0.463 | 0.421 | 0.582 | 0.286 | 0.681 | 0.665 | 0.739 | 0.457 | 0.589 | 0.532 | 0.534 | 0.534 | 0.53 | 0.623 | 0.669 | 0.648 | 0.617 | 0.283 | 0.312 | 0.689 | 0.513 | 0.64 | 0.556 | 0.326 | 0.562 | 0.594 | 0.603 | 0.485 | 0.483 | 0.652 | 0.323 | 0.602 | 0.469 | 0.606 | 0.527 | 0.623 | 0.492 | 0.688 | 0.69 | 0.517 | 0.519 | 0.465 | 0.423 | 0.54 | 0.594 | 0.688 | 0.51 | 0.342 | 0.614 | 0.734 | 0.557 | 0.464 | 0.411 | 0.53 | 0.435 | 0.328 | 0.565 | 0.489 | 0.661 | 0.331 | 0.439 | 0.642 | 0.643 | 0.66 | 0.708 | 0.653 | 0.489 | 0.516 | 0.668 | 0.653 | 0.5 | 0.348 | 0.503 | 0.597 | 0.617 | 0.468 | 0.532 | 0.562 | 0.685 | 0.564 | 0.677 | 0.658 | 0.513 | 0.612 | 0.518 | 0.478 | 0.544 | 0.454 | 0.561 | 0.378 | 0.62 | 0.468 | 0.523 | 0.728 | 0.453 | 0.506 | 0.434 | 0.589 | 0.326 | 0.483 | 0.333 | 0.541 | 0.382 | 0.331 | 0.643 | 0.554 | 0.551 | 0.735 | 0.59 | 0.692 | 0.638 | 0.598 | 0.476 | 0.681 | 0.546 | 0.406 | 0.665 | 0.499 | 0.416 | 0.513 | 0.505 | 0.413 | 0.504 | 0.522 | 0.337 | 0.493 | 0.33 | 0.45 | 0.67 | 0.65 | 0.681 | 0.321 | 0.658 | 0.562 | 0.586 | 0.344 | 0.526 | 0.488 | 0.438 | 0.365 | 0.479 | 0.324 | 0.657 | 0.597 | 0.576 | 0.618 | 0.318 | 0.345 | 0.301 | 0.497 | 0.457 | 0.614 | 0.608 | 0.449 | 0.625 | 0.617 | 0.565 | 0.671 | 0.551 | 0.303 | 0.488 | 0.559 | 0.585 |